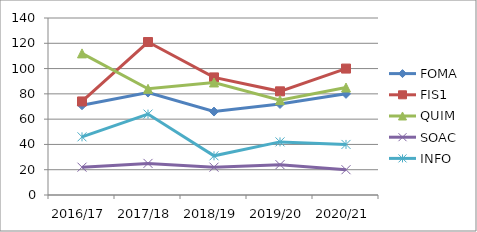
| Category | FOMA | FIS1 | QUIM | SOAC | INFO |
|---|---|---|---|---|---|
| 2016/17 | 71 | 74 | 112 | 22 | 46 |
| 2017/18 | 81 | 121 | 84 | 25 | 64 |
| 2018/19 | 66 | 93 | 89 | 22 | 31 |
| 2019/20 | 72 | 82 | 75 | 24 | 42 |
| 2020/21 | 80 | 100 | 85 | 20 | 40 |